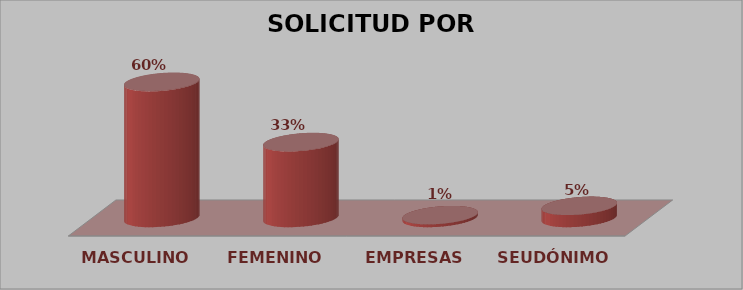
| Category | SOLICITUD POR GÉNERO | Series 1 |
|---|---|---|
| MASCULINO | 190 | 0.599 |
| FEMENINO | 106 | 0.334 |
| EMPRESAS | 4 | 0.013 |
| SEUDÓNIMO | 17 | 0.054 |